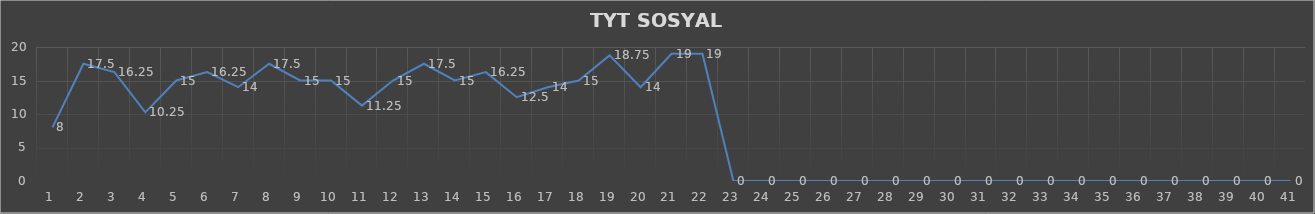
| Category | Series 0 |
|---|---|
| 0 | 8 |
| 1 | 17.5 |
| 2 | 16.25 |
| 3 | 10.25 |
| 4 | 15 |
| 5 | 16.25 |
| 6 | 14 |
| 7 | 17.5 |
| 8 | 15 |
| 9 | 15 |
| 10 | 11.25 |
| 11 | 15 |
| 12 | 17.5 |
| 13 | 15 |
| 14 | 16.25 |
| 15 | 12.5 |
| 16 | 14 |
| 17 | 15 |
| 18 | 18.75 |
| 19 | 14 |
| 20 | 19 |
| 21 | 19 |
| 22 | 0 |
| 23 | 0 |
| 24 | 0 |
| 25 | 0 |
| 26 | 0 |
| 27 | 0 |
| 28 | 0 |
| 29 | 0 |
| 30 | 0 |
| 31 | 0 |
| 32 | 0 |
| 33 | 0 |
| 34 | 0 |
| 35 | 0 |
| 36 | 0 |
| 37 | 0 |
| 38 | 0 |
| 39 | 0 |
| 40 | 0 |